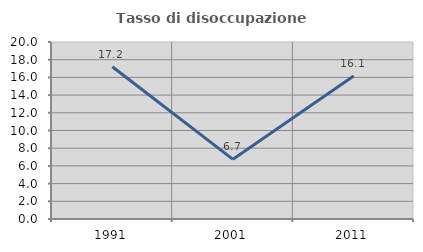
| Category | Tasso di disoccupazione giovanile  |
|---|---|
| 1991.0 | 17.211 |
| 2001.0 | 6.742 |
| 2011.0 | 16.149 |